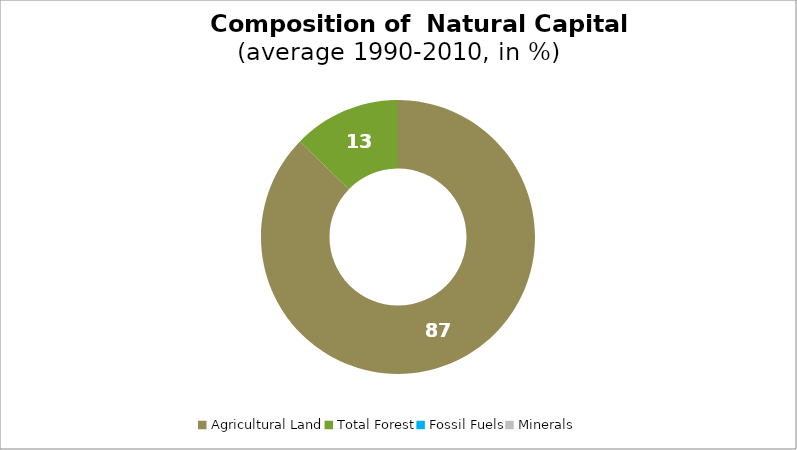
| Category | Series 0 |
|---|---|
| Agricultural Land | 87.292 |
| Total Forest | 12.708 |
| Fossil Fuels | 0 |
| Minerals | 0 |